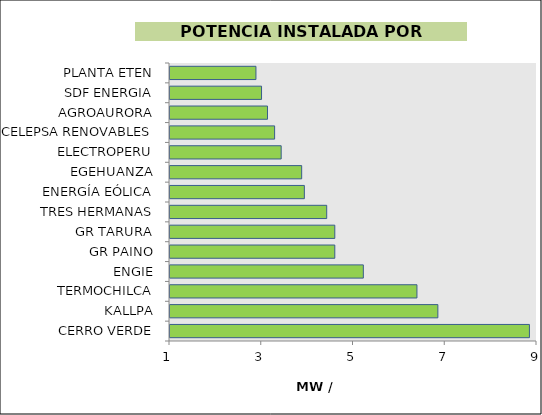
| Category | Series 0 |
|---|---|
| CERRO VERDE | 8.835 |
| KALLPA | 6.839 |
| TERMOCHILCA | 6.383 |
| ENGIE | 5.214 |
| GR PAINO | 4.592 |
| GR TARURA | 4.592 |
| TRES HERMANAS | 4.416 |
| ENERGÍA EÓLICA | 3.929 |
| EGEHUANZA | 3.87 |
| ELECTROPERU | 3.423 |
| CELEPSA RENOVABLES | 3.28 |
| AGROAURORA | 3.125 |
| SDF ENERGIA | 2.995 |
| PLANTA ETEN | 2.874 |